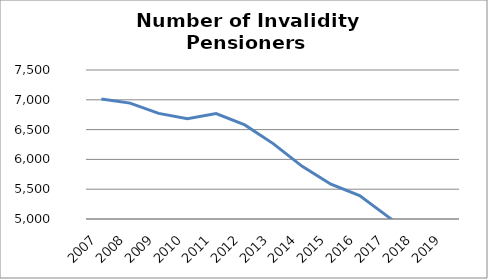
| Category | Series 1 | Series 0 |
|---|---|---|
| 2007.0 | 2007 | 7013 |
| 2008.0 | 2008 | 6944 |
| 2009.0 | 2009 | 6772 |
| 2010.0 | 2010 | 6683 |
| 2011.0 | 2011 | 6768 |
| 2012.0 | 2012 | 6578 |
| 2013.0 | 2013 | 6261 |
| 2014.0 | 2014 | 5883 |
| 2015.0 | 2015 | 5583 |
| 2016.0 | 2016 | 5392 |
| 2017.0 | 2017 | 5035 |
| 2018.0 | 2018 | 4683 |
| 2019.0 | 2019 | 4377 |